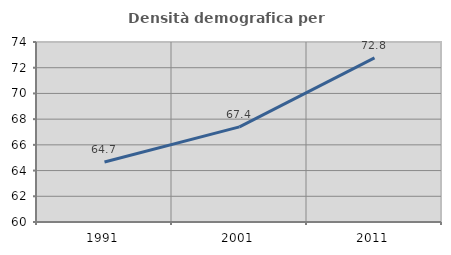
| Category | Densità demografica |
|---|---|
| 1991.0 | 64.663 |
| 2001.0 | 67.397 |
| 2011.0 | 72.759 |